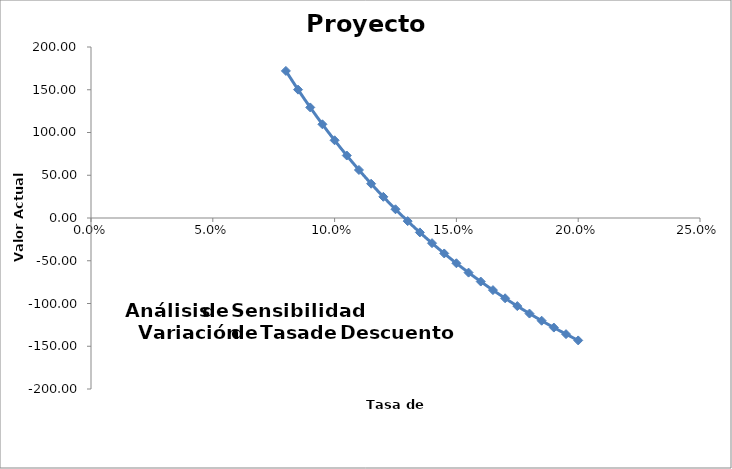
| Category | Series 0 |
|---|---|
| 0.08 | 172.031 |
| 0.085 | 150.114 |
| 0.09 | 129.327 |
| 0.095 | 109.6 |
| 0.1 | 90.87 |
| 0.105 | 73.078 |
| 0.11 | 56.167 |
| 0.115 | 40.086 |
| 0.12 | 24.787 |
| 0.125 | 10.224 |
| 0.13 | -3.645 |
| 0.135 | -16.86 |
| 0.14 | -29.458 |
| 0.145 | -41.473 |
| 0.15 | -52.939 |
| 0.155 | -63.885 |
| 0.16 | -74.34 |
| 0.165 | -84.331 |
| 0.17 | -93.883 |
| 0.175 | -103.019 |
| 0.18 | -111.762 |
| 0.185 | -120.133 |
| 0.19 | -128.151 |
| 0.195 | -135.834 |
| 0.2 | -143.2 |